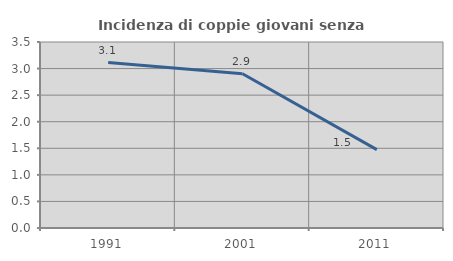
| Category | Incidenza di coppie giovani senza figli |
|---|---|
| 1991.0 | 3.113 |
| 2001.0 | 2.902 |
| 2011.0 | 1.474 |